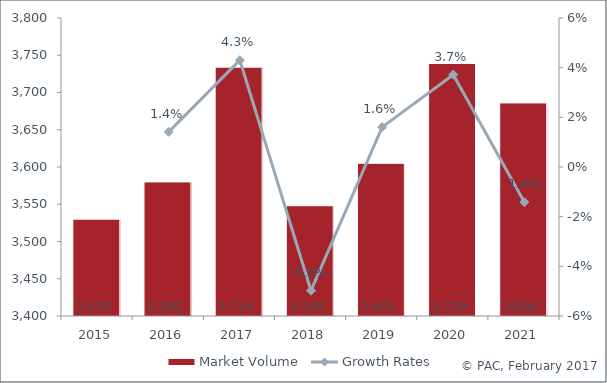
| Category | Market Volume |
|---|---|
| 2015.0 | 3530 |
| 2016.0 | 3580 |
| 2017.0 | 3734 |
| 2018.0 | 3548 |
| 2019.0 | 3605 |
| 2020.0 | 3739 |
| 2021.0 | 3686 |